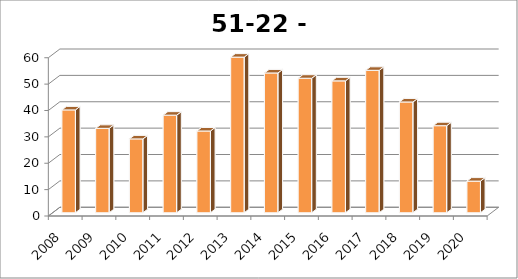
| Category | Spoordonk |
|---|---|
| 2008.0 | 39 |
| 2009.0 | 32 |
| 2010.0 | 28 |
| 2011.0 | 37 |
| 2012.0 | 31 |
| 2013.0 | 59 |
| 2014.0 | 53 |
| 2015.0 | 51 |
| 2016.0 | 50 |
| 2017.0 | 54 |
| 2018.0 | 42 |
| 2019.0 | 33 |
| 2020.0 | 12 |